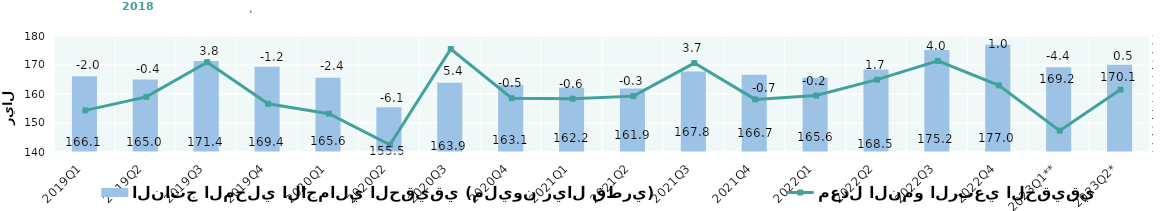
| Category | الناتج المحلي الاجمالي الحقيقي (مليون ريال قطري)  |
|---|---|
| 2019Q1 | 166107.183 |
| 2019Q2 | 165024.953 |
| 2019Q3 | 171410.464 |
| 2019Q4 | 169389.535 |
| 2020Q1 | 165614.977 |
| 2020Q2 | 155452.718 |
| 2020Q3 | 163897.514 |
| 2020Q4 | 163062.24 |
| 2021Q1 | 162182.834 |
| 2021Q2 | 161924.617 |
| 2021Q3 | 167781.848 |
| 2021Q4 | 166680.563 |
| 2022Q1 | 165599.931 |
| 2022Q2 | 168473.607 |
| 2022Q3 | 175199.537 |
| 2022Q4 | 177015.145 |
| 2023Q1** | 169191.253 |
| 2023Q2* | 170092.852 |